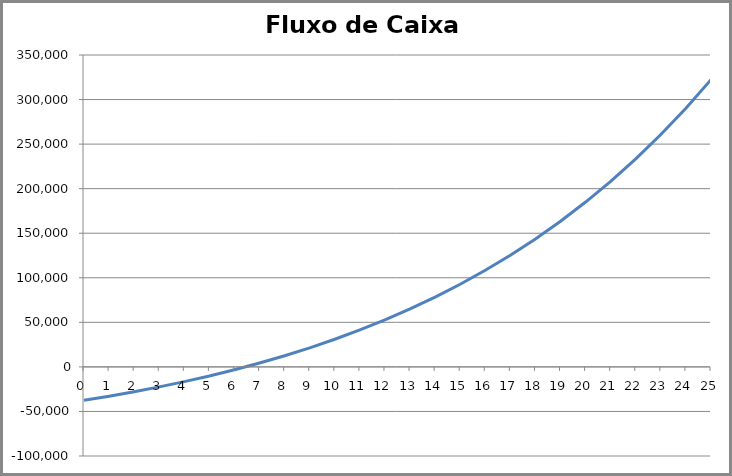
| Category | Fluxo de Caixa Acumulado |
|---|---|
| 0.0 | -37500 |
| 1.0 | -32893.8 |
| 2.0 | -27890.512 |
| 3.0 | -22457.09 |
| 4.0 | -16557.791 |
| 5.0 | -10153.959 |
| 6.0 | -3203.792 |
| 7.0 | 4337.916 |
| 8.0 | 12520.044 |
| 9.0 | 21395.443 |
| 10.0 | 31021.255 |
| 11.0 | 41459.255 |
| 12.0 | 52776.227 |
| 13.0 | 65044.363 |
| 14.0 | 78341.701 |
| 15.0 | 92752.59 |
| 16.0 | 108368.198 |
| 17.0 | 125287.06 |
| 18.0 | 143615.665 |
| 19.0 | 163469.098 |
| 20.0 | 184971.725 |
| 21.0 | 208257.935 |
| 22.0 | 233472.946 |
| 23.0 | 260773.671 |
| 24.0 | 290329.648 |
| 25.0 | 322324.058 |